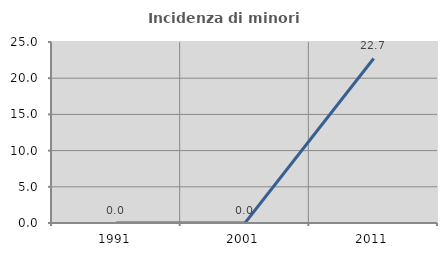
| Category | Incidenza di minori stranieri |
|---|---|
| 1991.0 | 0 |
| 2001.0 | 0 |
| 2011.0 | 22.727 |